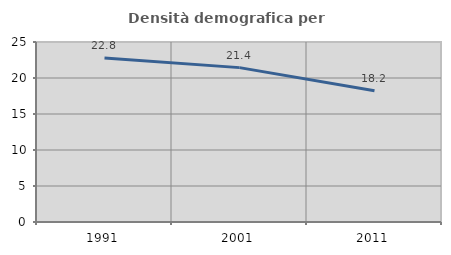
| Category | Densità demografica |
|---|---|
| 1991.0 | 22.774 |
| 2001.0 | 21.441 |
| 2011.0 | 18.227 |